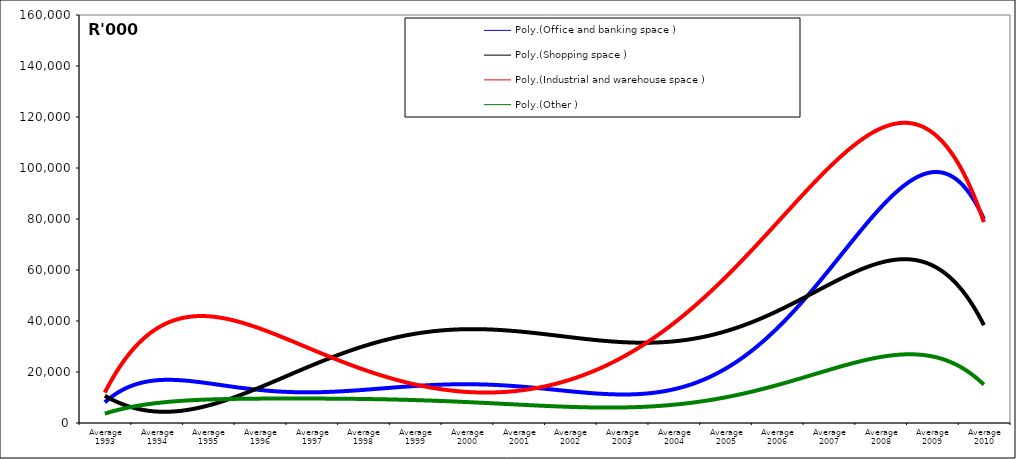
| Category | Office and banking space | Shopping space | Industrial and warehouse space | Other |
|---|---|---|---|---|
| Average 1993 | 4589.833 | 8521.917 | 14460.417 | 4149.25 |
| Average 1994 | 27548 | 7273 | 23658.417 | 6637.667 |
| Average 1995 | 7632.833 | 14592.083 | 62975.083 | 9236.333 |
| Average 1996 | 11382 | 7548.667 | 31883.167 | 10698.917 |
| Average 1997 | 12204 | 10886.083 | 19974 | 10343.75 |
| Average 1998 | 12456.75 | 13279.583 | 21669.333 | 7928.083 |
| Average 1999 | 20132 | 89936.583 | 11261.833 | 9889.583 |
| Average 2000 | 8566.167 | 28239.25 | 18105.833 | 6037.167 |
| Average 2001 | 23872.667 | 4859.333 | 16001.25 | 7376.667 |
| Average 2002 | 10190.5 | 24836.833 | 25362.833 | 9184.667 |
| Average 2003 | 5636.167 | 58835.75 | 19439.167 | 4632.75 |
| Average 2004 | 15010.917 | 28198.75 | 28292.417 | 8784.667 |
| Average 2005 | 12175.833 | 39097.667 | 55472.5 | 6560.75 |
| Average 2006 | 53851.083 | 32899.917 | 90039.167 | 15331.583 |
| Average 2007 | 46461.083 | 52106.5 | 89748.667 | 25820 |
| Average 2008 | 98955.083 | 78463.167 | 136256.917 | 19537.75 |
| Average 2009 | 86428.667 | 50133.417 | 94567.833 | 29553.583 |
| Average 2010 | 83295.5 | 41014.833 | 84077 | 14194.667 |